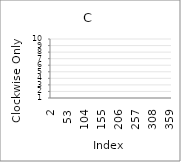
| Category | Series 0 |
|---|---|
| 2.0 | 3 |
| 3.0 | 8 |
| 4.0 | 4 |
| 5.0 | 2 |
| 6.0 | 1 |
| 7.0 | 7 |
| 8.0 | 8 |
| 9.0 | 1 |
| 10.0 | 7 |
| 11.0 | 10 |
| 12.0 | 6 |
| 13.0 | 9 |
| 14.0 | 9 |
| 15.0 | 3 |
| 16.0 | 5 |
| 17.0 | 10 |
| 18.0 | 6 |
| 19.0 | 7 |
| 20.0 | 7 |
| 21.0 | 3 |
| 22.0 | 9 |
| 23.0 | 1 |
| 24.0 | 3 |
| 25.0 | 3 |
| 26.0 | 10 |
| 27.0 | 9 |
| 28.0 | 8 |
| 29.0 | 2 |
| 30.0 | 10 |
| 31.0 | 6 |
| 32.0 | 10 |
| 33.0 | 3 |
| 34.0 | 8 |
| 35.0 | 2 |
| 36.0 | 10 |
| 37.0 | 7 |
| 38.0 | 9 |
| 39.0 | 2 |
| 40.0 | 1 |
| 41.0 | 2 |
| 42.0 | 4 |
| 43.0 | 7 |
| 44.0 | 5 |
| 45.0 | 7 |
| 46.0 | 9 |
| 47.0 | 4 |
| 48.0 | 9 |
| 49.0 | 4 |
| 50.0 | 7 |
| 51.0 | 7 |
| 52.0 | 7 |
| 53.0 | 7 |
| 54.0 | 4 |
| 55.0 | 5 |
| 56.0 | 1 |
| 57.0 | 2 |
| 58.0 | 8 |
| 59.0 | 3 |
| 60.0 | 7 |
| 61.0 | 7 |
| 62.0 | 6 |
| 63.0 | 3 |
| 64.0 | 5 |
| 65.0 | 3 |
| 66.0 | 1 |
| 67.0 | 5 |
| 68.0 | 9 |
| 69.0 | 2 |
| 70.0 | 5 |
| 71.0 | 3 |
| 72.0 | 4 |
| 73.0 | 6 |
| 74.0 | 3 |
| 75.0 | 5 |
| 76.0 | 10 |
| 77.0 | 6 |
| 78.0 | 3 |
| 79.0 | 8 |
| 80.0 | 1 |
| 81.0 | 7 |
| 82.0 | 3 |
| 83.0 | 10 |
| 84.0 | 7 |
| 85.0 | 1 |
| 86.0 | 9 |
| 87.0 | 1 |
| 88.0 | 4 |
| 89.0 | 3 |
| 90.0 | 10 |
| 91.0 | 2 |
| 92.0 | 5 |
| 93.0 | 2 |
| 94.0 | 5 |
| 95.0 | 7 |
| 96.0 | 9 |
| 97.0 | 8 |
| 98.0 | 3 |
| 99.0 | 5 |
| 100.0 | 4 |
| 101.0 | 8 |
| 102.0 | 2 |
| 103.0 | 3 |
| 104.0 | 1 |
| 105.0 | 4 |
| 106.0 | 7 |
| 107.0 | 3 |
| 108.0 | 3 |
| 109.0 | 5 |
| 110.0 | 4 |
| 111.0 | 1 |
| 112.0 | 3 |
| 113.0 | 8 |
| 114.0 | 3 |
| 115.0 | 5 |
| 116.0 | 2 |
| 117.0 | 1 |
| 118.0 | 2 |
| 119.0 | 4 |
| 120.0 | 6 |
| 121.0 | 3 |
| 122.0 | 3 |
| 123.0 | 1 |
| 124.0 | 2 |
| 125.0 | 8 |
| 126.0 | 7 |
| 127.0 | 6 |
| 128.0 | 8 |
| 129.0 | 9 |
| 130.0 | 2 |
| 131.0 | 10 |
| 132.0 | 2 |
| 133.0 | 1 |
| 134.0 | 7 |
| 135.0 | 1 |
| 136.0 | 9 |
| 137.0 | 10 |
| 138.0 | 3 |
| 139.0 | 5 |
| 140.0 | 7 |
| 141.0 | 10 |
| 142.0 | 2 |
| 143.0 | 3 |
| 144.0 | 4 |
| 145.0 | 2 |
| 146.0 | 6 |
| 147.0 | 4 |
| 148.0 | 10 |
| 149.0 | 1 |
| 150.0 | 4 |
| 151.0 | 2 |
| 152.0 | 1 |
| 153.0 | 2 |
| 154.0 | 5 |
| 155.0 | 4 |
| 156.0 | 9 |
| 157.0 | 6 |
| 158.0 | 4 |
| 159.0 | 3 |
| 160.0 | 8 |
| 161.0 | 5 |
| 162.0 | 7 |
| 163.0 | 4 |
| 164.0 | 4 |
| 165.0 | 8 |
| 166.0 | 3 |
| 167.0 | 2 |
| 168.0 | 1 |
| 169.0 | 9 |
| 170.0 | 10 |
| 171.0 | 7 |
| 172.0 | 9 |
| 173.0 | 8 |
| 174.0 | 6 |
| 175.0 | 9 |
| 176.0 | 5 |
| 177.0 | 9 |
| 178.0 | 5 |
| 179.0 | 1 |
| 180.0 | 2 |
| 181.0 | 5 |
| 182.0 | 6 |
| 183.0 | 1 |
| 184.0 | 4 |
| 185.0 | 6 |
| 186.0 | 1 |
| 187.0 | 7 |
| 188.0 | 3 |
| 189.0 | 5 |
| 190.0 | 2 |
| 191.0 | 5 |
| 192.0 | 10 |
| 193.0 | 8 |
| 194.0 | 2 |
| 195.0 | 1 |
| 196.0 | 4 |
| 197.0 | 6 |
| 198.0 | 3 |
| 199.0 | 10 |
| 200.0 | 8 |
| 201.0 | 3 |
| 202.0 | 7 |
| 203.0 | 4 |
| 204.0 | 8 |
| 205.0 | 2 |
| 206.0 | 9 |
| 207.0 | 7 |
| 208.0 | 2 |
| 209.0 | 3 |
| 210.0 | 5 |
| 211.0 | 10 |
| 212.0 | 8 |
| 213.0 | 5 |
| 214.0 | 8 |
| 215.0 | 10 |
| 216.0 | 2 |
| 217.0 | 8 |
| 218.0 | 5 |
| 219.0 | 6 |
| 220.0 | 4 |
| 221.0 | 3 |
| 222.0 | 4 |
| 223.0 | 5 |
| 224.0 | 3 |
| 225.0 | 7 |
| 226.0 | 2 |
| 227.0 | 1 |
| 228.0 | 4 |
| 229.0 | 8 |
| 230.0 | 5 |
| 231.0 | 10 |
| 232.0 | 3 |
| 233.0 | 9 |
| 234.0 | 7 |
| 235.0 | 6 |
| 236.0 | 6 |
| 237.0 | 2 |
| 238.0 | 4 |
| 239.0 | 5 |
| 240.0 | 10 |
| 241.0 | 1 |
| 242.0 | 7 |
| 243.0 | 6 |
| 244.0 | 9 |
| 245.0 | 1 |
| 246.0 | 7 |
| 247.0 | 3 |
| 248.0 | 8 |
| 249.0 | 6 |
| 250.0 | 2 |
| 251.0 | 8 |
| 252.0 | 1 |
| 253.0 | 7 |
| 254.0 | 5 |
| 255.0 | 6 |
| 256.0 | 5 |
| 257.0 | 10 |
| 258.0 | 6 |
| 259.0 | 7 |
| 260.0 | 3 |
| 261.0 | 9 |
| 262.0 | 10 |
| 263.0 | 1 |
| 264.0 | 2 |
| 265.0 | 1 |
| 266.0 | 10 |
| 267.0 | 2 |
| 268.0 | 4 |
| 269.0 | 2 |
| 270.0 | 7 |
| 271.0 | 9 |
| 272.0 | 7 |
| 273.0 | 4 |
| 274.0 | 2 |
| 275.0 | 6 |
| 276.0 | 8 |
| 277.0 | 7 |
| 278.0 | 6 |
| 279.0 | 3 |
| 280.0 | 3 |
| 281.0 | 7 |
| 282.0 | 4 |
| 283.0 | 7 |
| 284.0 | 5 |
| 285.0 | 3 |
| 286.0 | 5 |
| 287.0 | 10 |
| 288.0 | 1 |
| 289.0 | 7 |
| 290.0 | 7 |
| 291.0 | 6 |
| 292.0 | 4 |
| 293.0 | 10 |
| 294.0 | 7 |
| 295.0 | 3 |
| 296.0 | 7 |
| 297.0 | 6 |
| 298.0 | 4 |
| 299.0 | 10 |
| 300.0 | 4 |
| 301.0 | 1 |
| 302.0 | 1 |
| 303.0 | 8 |
| 304.0 | 6 |
| 305.0 | 9 |
| 306.0 | 8 |
| 307.0 | 8 |
| 308.0 | 6 |
| 309.0 | 2 |
| 310.0 | 5 |
| 311.0 | 2 |
| 312.0 | 7 |
| 313.0 | 9 |
| 314.0 | 2 |
| 315.0 | 5 |
| 316.0 | 4 |
| 317.0 | 4 |
| 318.0 | 8 |
| 319.0 | 1 |
| 320.0 | 8 |
| 321.0 | 8 |
| 322.0 | 7 |
| 323.0 | 10 |
| 324.0 | 10 |
| 325.0 | 3 |
| 326.0 | 2 |
| 327.0 | 9 |
| 328.0 | 8 |
| 329.0 | 9 |
| 330.0 | 3 |
| 331.0 | 3 |
| 332.0 | 3 |
| 333.0 | 9 |
| 334.0 | 10 |
| 335.0 | 1 |
| 336.0 | 5 |
| 337.0 | 9 |
| 338.0 | 8 |
| 339.0 | 2 |
| 340.0 | 2 |
| 341.0 | 5 |
| 342.0 | 10 |
| 343.0 | 9 |
| 344.0 | 1 |
| 345.0 | 4 |
| 346.0 | 1 |
| 347.0 | 9 |
| 348.0 | 9 |
| 349.0 | 7 |
| 350.0 | 1 |
| 351.0 | 7 |
| 352.0 | 8 |
| 353.0 | 8 |
| 354.0 | 7 |
| 355.0 | 10 |
| 356.0 | 3 |
| 357.0 | 10 |
| 358.0 | 3 |
| 359.0 | 3 |
| 360.0 | 8 |
| 361.0 | 6 |
| 362.0 | 1 |
| 363.0 | 10 |
| 364.0 | 4 |
| 365.0 | 10 |